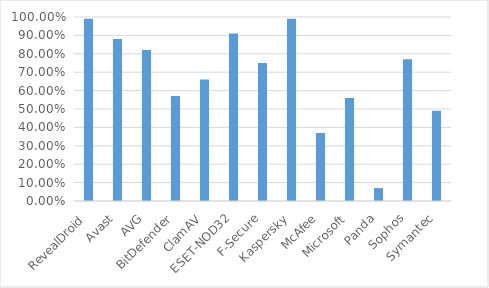
| Category | Series 0 |
|---|---|
| RevealDroid | 0.99 |
| Avast | 0.88 |
| AVG | 0.82 |
| BitDefender | 0.57 |
| ClamAV | 0.66 |
| ESET-NOD32 | 0.91 |
| F-Secure | 0.75 |
| Kaspersky | 0.99 |
| McAfee | 0.37 |
| Microsoft | 0.56 |
| Panda | 0.07 |
| Sophos | 0.77 |
| Symantec | 0.49 |